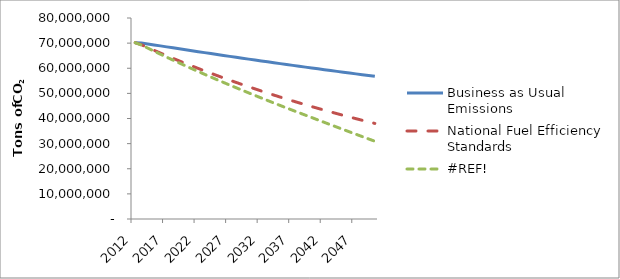
| Category | Business as Usual Emissions | National Fuel Efficiency Standards | #REF! |
|---|---|---|---|
| 2012.0 | 70168394.221 | 70168394.221 | 70168394.221 |
| 2013.0 | 70087630.003 | 69352493.571 | 69239274.059 |
| 2014.0 | 69690157.082 | 68235889.246 | 68007689.91 |
| 2015.0 | 69294932.929 | 67137257.551 | 66792218.666 |
| 2016.0 | 68901944.862 | 66056309.296 | 65592468.778 |
| 2017.0 | 68511180.268 | 64992759.94 | 64408050.282 |
| 2018.0 | 68122626.607 | 63946329.523 | 63238574.591 |
| 2019.0 | 67736271.411 | 62916742.584 | 62083654.289 |
| 2020.0 | 67352102.278 | 61903728.095 | 60942902.91 |
| 2021.0 | 66970106.878 | 60907019.387 | 59812361.635 |
| 2022.0 | 66590272.95 | 59926354.081 | 58695170.874 |
| 2023.0 | 66212588.302 | 58961474.017 | 57590943.066 |
| 2024.0 | 65837040.811 | 58012125.19 | 56499290.642 |
| 2025.0 | 65463618.421 | 57078057.679 | 55419825.78 |
| 2026.0 | 65092309.143 | 56159025.584 | 54352160.157 |
| 2027.0 | 64723101.057 | 55254786.959 | 53295904.7 |
| 2028.0 | 64355982.311 | 54365103.754 | 52250669.321 |
| 2029.0 | 63990941.116 | 53489741.742 | 51216062.654 |
| 2030.0 | 63627965.751 | 52628470.47 | 50191691.78 |
| 2031.0 | 63267044.563 | 51781063.189 | 49171721.04 |
| 2032.0 | 62908165.962 | 50947296.798 | 48161259.531 |
| 2033.0 | 62551318.423 | 50126951.784 | 47159910.552 |
| 2034.0 | 62196490.486 | 49319812.167 | 46167274.978 |
| 2035.0 | 61843670.757 | 48525665.441 | 45182950.966 |
| 2036.0 | 61492847.904 | 47744302.517 | 44206533.645 |
| 2037.0 | 61144010.66 | 46975517.672 | 43237614.796 |
| 2038.0 | 60797147.821 | 46219108.491 | 42275782.529 |
| 2039.0 | 60452248.246 | 45474875.815 | 41320620.945 |
| 2040.0 | 60109300.855 | 44742623.689 | 40371709.786 |
| 2041.0 | 59768294.633 | 44022159.313 | 39409142.773 |
| 2042.0 | 59429218.626 | 43313292.984 | 38452159.824 |
| 2043.0 | 59092061.939 | 42615838.055 | 37500332.593 |
| 2044.0 | 58756813.743 | 41929610.879 | 36553227.846 |
| 2045.0 | 58423463.265 | 41254430.765 | 35610407.108 |
| 2046.0 | 58091999.797 | 40590119.928 | 34671426.295 |
| 2047.0 | 57762412.687 | 39936503.445 | 33735835.343 |
| 2048.0 | 57434691.346 | 39293409.204 | 32803177.816 |
| 2049.0 | 57108825.243 | 38660667.865 | 31872990.506 |
| 2050.0 | 56784803.907 | 38038112.811 | 30944803.022 |